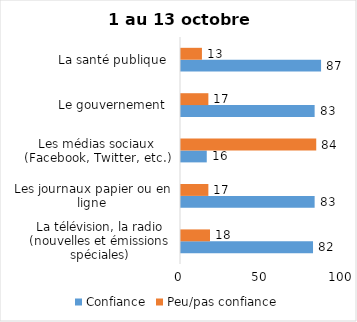
| Category | Confiance | Peu/pas confiance |
|---|---|---|
| La télévision, la radio (nouvelles et émissions spéciales) | 82 | 18 |
| Les journaux papier ou en ligne | 83 | 17 |
| Les médias sociaux (Facebook, Twitter, etc.) | 16 | 84 |
| Le gouvernement  | 83 | 17 |
| La santé publique  | 87 | 13 |